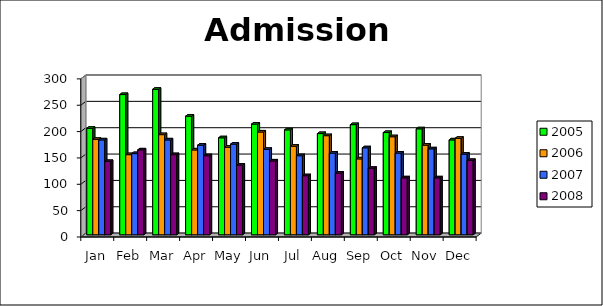
| Category | 2000 | 2001 | 2004 | 2005 | 2006 | 2007 | 2008 |
|---|---|---|---|---|---|---|---|
| Jan |  |  |  | 202 | 181 | 180 | 139 |
| Feb |  |  |  | 266 | 152 | 154 | 161 |
| Mar |  |  |  | 276 | 190 | 180 | 152 |
| Apr |  |  |  | 225 | 161 | 170 | 150 |
| May |  |  |  | 184 | 166 | 172 | 132 |
| Jun |  |  |  | 210 | 195 | 162 | 140 |
| Jul |  |  |  | 199 | 168 | 150 | 112 |
| Aug |  |  |  | 192 | 188 | 155 | 117 |
| Sep |  |  |  | 209 | 144 | 165 | 126 |
| Oct |  |  |  | 194 | 186 | 155 | 108 |
| Nov |  |  |  | 201 | 170 | 163 | 108 |
| Dec |  |  |  | 180 | 183 | 153 | 141 |